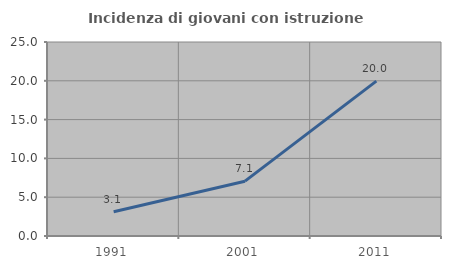
| Category | Incidenza di giovani con istruzione universitaria |
|---|---|
| 1991.0 | 3.125 |
| 2001.0 | 7.065 |
| 2011.0 | 19.958 |